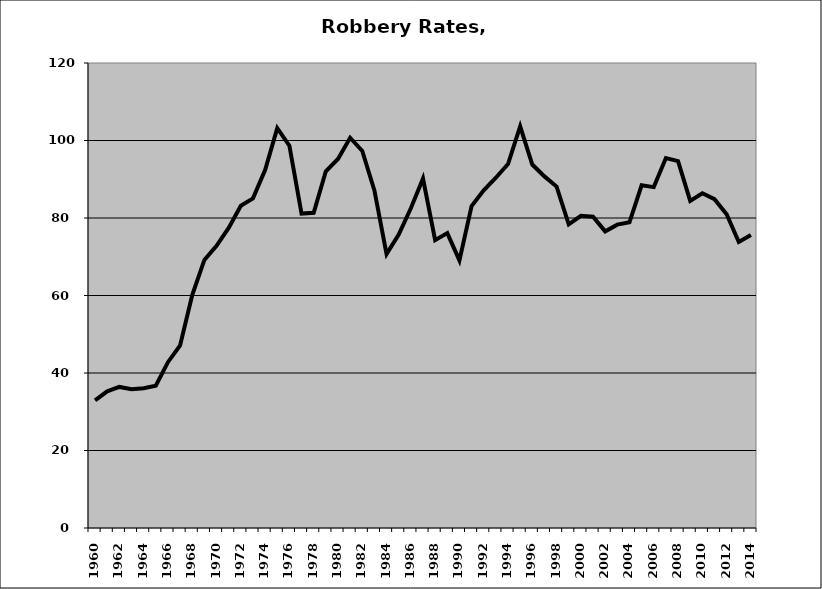
| Category | Robbery |
|---|---|
| 1960.0 | 32.948 |
| 1961.0 | 35.273 |
| 1962.0 | 36.405 |
| 1963.0 | 35.832 |
| 1964.0 | 36.087 |
| 1965.0 | 36.71 |
| 1966.0 | 42.79 |
| 1967.0 | 47.099 |
| 1968.0 | 60.111 |
| 1969.0 | 69.183 |
| 1970.0 | 72.811 |
| 1971.0 | 77.422 |
| 1972.0 | 83.177 |
| 1973.0 | 85.069 |
| 1974.0 | 92.344 |
| 1975.0 | 103.18 |
| 1976.0 | 98.658 |
| 1977.0 | 81.145 |
| 1978.0 | 81.332 |
| 1979.0 | 92.061 |
| 1980.0 | 95.236 |
| 1981.0 | 100.71 |
| 1982.0 | 97.3 |
| 1983.0 | 87.13 |
| 1984.0 | 70.669 |
| 1985.0 | 75.711 |
| 1986.0 | 82.511 |
| 1987.0 | 90.18 |
| 1988.0 | 74.281 |
| 1989.0 | 76.093 |
| 1990.0 | 69.058 |
| 1991.0 | 83.06 |
| 1992.0 | 87.164 |
| 1993.0 | 90.393 |
| 1994.0 | 93.938 |
| 1995.0 | 103.653 |
| 1996.0 | 93.795 |
| 1997.0 | 90.737 |
| 1998.0 | 88.11 |
| 1999.0 | 78.368 |
| 2000.0 | 80.559 |
| 2001.0 | 80.343 |
| 2002.0 | 76.556 |
| 2003.0 | 78.287 |
| 2004.0 | 78.902 |
| 2005.0 | 88.434 |
| 2006.0 | 87.968 |
| 2007.0 | 95.486 |
| 2008.0 | 94.684 |
| 2009.0 | 84.421 |
| 2010.0 | 86.372 |
| 2011.0 | 84.844 |
| 2012.0 | 80.987 |
| 2013.0 | 73.802 |
| 2014.0 | 75.587 |